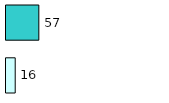
| Category | Series 0 | Series 1 |
|---|---|---|
| 0 | 16 | 57 |